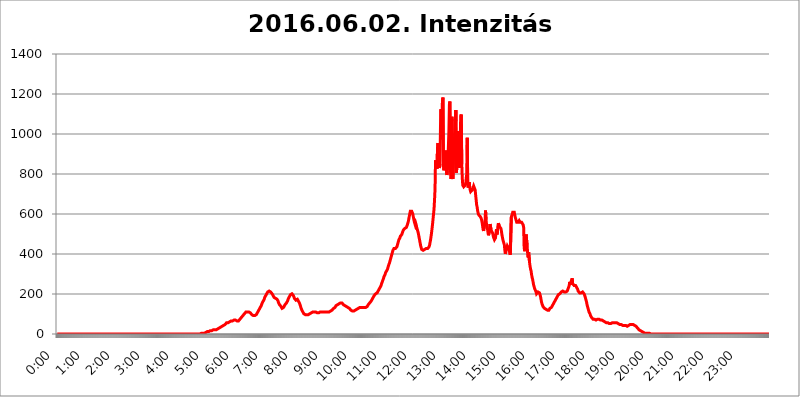
| Category | 2016.06.02. Intenzitás [W/m^2] |
|---|---|
| 0.0 | 0 |
| 0.0006944444444444445 | 0 |
| 0.001388888888888889 | 0 |
| 0.0020833333333333333 | 0 |
| 0.002777777777777778 | 0 |
| 0.003472222222222222 | 0 |
| 0.004166666666666667 | 0 |
| 0.004861111111111111 | 0 |
| 0.005555555555555556 | 0 |
| 0.0062499999999999995 | 0 |
| 0.006944444444444444 | 0 |
| 0.007638888888888889 | 0 |
| 0.008333333333333333 | 0 |
| 0.009027777777777779 | 0 |
| 0.009722222222222222 | 0 |
| 0.010416666666666666 | 0 |
| 0.011111111111111112 | 0 |
| 0.011805555555555555 | 0 |
| 0.012499999999999999 | 0 |
| 0.013194444444444444 | 0 |
| 0.013888888888888888 | 0 |
| 0.014583333333333332 | 0 |
| 0.015277777777777777 | 0 |
| 0.015972222222222224 | 0 |
| 0.016666666666666666 | 0 |
| 0.017361111111111112 | 0 |
| 0.018055555555555557 | 0 |
| 0.01875 | 0 |
| 0.019444444444444445 | 0 |
| 0.02013888888888889 | 0 |
| 0.020833333333333332 | 0 |
| 0.02152777777777778 | 0 |
| 0.022222222222222223 | 0 |
| 0.02291666666666667 | 0 |
| 0.02361111111111111 | 0 |
| 0.024305555555555556 | 0 |
| 0.024999999999999998 | 0 |
| 0.025694444444444447 | 0 |
| 0.02638888888888889 | 0 |
| 0.027083333333333334 | 0 |
| 0.027777777777777776 | 0 |
| 0.02847222222222222 | 0 |
| 0.029166666666666664 | 0 |
| 0.029861111111111113 | 0 |
| 0.030555555555555555 | 0 |
| 0.03125 | 0 |
| 0.03194444444444445 | 0 |
| 0.03263888888888889 | 0 |
| 0.03333333333333333 | 0 |
| 0.034027777777777775 | 0 |
| 0.034722222222222224 | 0 |
| 0.035416666666666666 | 0 |
| 0.036111111111111115 | 0 |
| 0.03680555555555556 | 0 |
| 0.0375 | 0 |
| 0.03819444444444444 | 0 |
| 0.03888888888888889 | 0 |
| 0.03958333333333333 | 0 |
| 0.04027777777777778 | 0 |
| 0.04097222222222222 | 0 |
| 0.041666666666666664 | 0 |
| 0.042361111111111106 | 0 |
| 0.04305555555555556 | 0 |
| 0.043750000000000004 | 0 |
| 0.044444444444444446 | 0 |
| 0.04513888888888889 | 0 |
| 0.04583333333333334 | 0 |
| 0.04652777777777778 | 0 |
| 0.04722222222222222 | 0 |
| 0.04791666666666666 | 0 |
| 0.04861111111111111 | 0 |
| 0.049305555555555554 | 0 |
| 0.049999999999999996 | 0 |
| 0.05069444444444445 | 0 |
| 0.051388888888888894 | 0 |
| 0.052083333333333336 | 0 |
| 0.05277777777777778 | 0 |
| 0.05347222222222222 | 0 |
| 0.05416666666666667 | 0 |
| 0.05486111111111111 | 0 |
| 0.05555555555555555 | 0 |
| 0.05625 | 0 |
| 0.05694444444444444 | 0 |
| 0.057638888888888885 | 0 |
| 0.05833333333333333 | 0 |
| 0.05902777777777778 | 0 |
| 0.059722222222222225 | 0 |
| 0.06041666666666667 | 0 |
| 0.061111111111111116 | 0 |
| 0.06180555555555556 | 0 |
| 0.0625 | 0 |
| 0.06319444444444444 | 0 |
| 0.06388888888888888 | 0 |
| 0.06458333333333334 | 0 |
| 0.06527777777777778 | 0 |
| 0.06597222222222222 | 0 |
| 0.06666666666666667 | 0 |
| 0.06736111111111111 | 0 |
| 0.06805555555555555 | 0 |
| 0.06874999999999999 | 0 |
| 0.06944444444444443 | 0 |
| 0.07013888888888889 | 0 |
| 0.07083333333333333 | 0 |
| 0.07152777777777779 | 0 |
| 0.07222222222222223 | 0 |
| 0.07291666666666667 | 0 |
| 0.07361111111111111 | 0 |
| 0.07430555555555556 | 0 |
| 0.075 | 0 |
| 0.07569444444444444 | 0 |
| 0.0763888888888889 | 0 |
| 0.07708333333333334 | 0 |
| 0.07777777777777778 | 0 |
| 0.07847222222222222 | 0 |
| 0.07916666666666666 | 0 |
| 0.0798611111111111 | 0 |
| 0.08055555555555556 | 0 |
| 0.08125 | 0 |
| 0.08194444444444444 | 0 |
| 0.08263888888888889 | 0 |
| 0.08333333333333333 | 0 |
| 0.08402777777777777 | 0 |
| 0.08472222222222221 | 0 |
| 0.08541666666666665 | 0 |
| 0.08611111111111112 | 0 |
| 0.08680555555555557 | 0 |
| 0.08750000000000001 | 0 |
| 0.08819444444444445 | 0 |
| 0.08888888888888889 | 0 |
| 0.08958333333333333 | 0 |
| 0.09027777777777778 | 0 |
| 0.09097222222222222 | 0 |
| 0.09166666666666667 | 0 |
| 0.09236111111111112 | 0 |
| 0.09305555555555556 | 0 |
| 0.09375 | 0 |
| 0.09444444444444444 | 0 |
| 0.09513888888888888 | 0 |
| 0.09583333333333333 | 0 |
| 0.09652777777777777 | 0 |
| 0.09722222222222222 | 0 |
| 0.09791666666666667 | 0 |
| 0.09861111111111111 | 0 |
| 0.09930555555555555 | 0 |
| 0.09999999999999999 | 0 |
| 0.10069444444444443 | 0 |
| 0.1013888888888889 | 0 |
| 0.10208333333333335 | 0 |
| 0.10277777777777779 | 0 |
| 0.10347222222222223 | 0 |
| 0.10416666666666667 | 0 |
| 0.10486111111111111 | 0 |
| 0.10555555555555556 | 0 |
| 0.10625 | 0 |
| 0.10694444444444444 | 0 |
| 0.1076388888888889 | 0 |
| 0.10833333333333334 | 0 |
| 0.10902777777777778 | 0 |
| 0.10972222222222222 | 0 |
| 0.1111111111111111 | 0 |
| 0.11180555555555556 | 0 |
| 0.11180555555555556 | 0 |
| 0.1125 | 0 |
| 0.11319444444444444 | 0 |
| 0.11388888888888889 | 0 |
| 0.11458333333333333 | 0 |
| 0.11527777777777777 | 0 |
| 0.11597222222222221 | 0 |
| 0.11666666666666665 | 0 |
| 0.1173611111111111 | 0 |
| 0.11805555555555557 | 0 |
| 0.11944444444444445 | 0 |
| 0.12013888888888889 | 0 |
| 0.12083333333333333 | 0 |
| 0.12152777777777778 | 0 |
| 0.12222222222222223 | 0 |
| 0.12291666666666667 | 0 |
| 0.12291666666666667 | 0 |
| 0.12361111111111112 | 0 |
| 0.12430555555555556 | 0 |
| 0.125 | 0 |
| 0.12569444444444444 | 0 |
| 0.12638888888888888 | 0 |
| 0.12708333333333333 | 0 |
| 0.16875 | 0 |
| 0.12847222222222224 | 0 |
| 0.12916666666666668 | 0 |
| 0.12986111111111112 | 0 |
| 0.13055555555555556 | 0 |
| 0.13125 | 0 |
| 0.13194444444444445 | 0 |
| 0.1326388888888889 | 0 |
| 0.13333333333333333 | 0 |
| 0.13402777777777777 | 0 |
| 0.13402777777777777 | 0 |
| 0.13472222222222222 | 0 |
| 0.13541666666666666 | 0 |
| 0.1361111111111111 | 0 |
| 0.13749999999999998 | 0 |
| 0.13819444444444443 | 0 |
| 0.1388888888888889 | 0 |
| 0.13958333333333334 | 0 |
| 0.14027777777777778 | 0 |
| 0.14097222222222222 | 0 |
| 0.14166666666666666 | 0 |
| 0.1423611111111111 | 0 |
| 0.14305555555555557 | 0 |
| 0.14375000000000002 | 0 |
| 0.14444444444444446 | 0 |
| 0.1451388888888889 | 0 |
| 0.1451388888888889 | 0 |
| 0.14652777777777778 | 0 |
| 0.14722222222222223 | 0 |
| 0.14791666666666667 | 0 |
| 0.1486111111111111 | 0 |
| 0.14930555555555555 | 0 |
| 0.15 | 0 |
| 0.15069444444444444 | 0 |
| 0.15138888888888888 | 0 |
| 0.15208333333333332 | 0 |
| 0.15277777777777776 | 0 |
| 0.15347222222222223 | 0 |
| 0.15416666666666667 | 0 |
| 0.15486111111111112 | 0 |
| 0.15555555555555556 | 0 |
| 0.15625 | 0 |
| 0.15694444444444444 | 0 |
| 0.15763888888888888 | 0 |
| 0.15833333333333333 | 0 |
| 0.15902777777777777 | 0 |
| 0.15972222222222224 | 0 |
| 0.16041666666666668 | 0 |
| 0.16111111111111112 | 0 |
| 0.16180555555555556 | 0 |
| 0.1625 | 0 |
| 0.16319444444444445 | 0 |
| 0.1638888888888889 | 0 |
| 0.16458333333333333 | 0 |
| 0.16527777777777777 | 0 |
| 0.16597222222222222 | 0 |
| 0.16666666666666666 | 0 |
| 0.1673611111111111 | 0 |
| 0.16805555555555554 | 0 |
| 0.16874999999999998 | 0 |
| 0.16944444444444443 | 0 |
| 0.17013888888888887 | 0 |
| 0.1708333333333333 | 0 |
| 0.17152777777777775 | 0 |
| 0.17222222222222225 | 0 |
| 0.1729166666666667 | 0 |
| 0.17361111111111113 | 0 |
| 0.17430555555555557 | 0 |
| 0.17500000000000002 | 0 |
| 0.17569444444444446 | 0 |
| 0.1763888888888889 | 0 |
| 0.17708333333333334 | 0 |
| 0.17777777777777778 | 0 |
| 0.17847222222222223 | 0 |
| 0.17916666666666667 | 0 |
| 0.1798611111111111 | 0 |
| 0.18055555555555555 | 0 |
| 0.18125 | 0 |
| 0.18194444444444444 | 0 |
| 0.1826388888888889 | 0 |
| 0.18333333333333335 | 0 |
| 0.1840277777777778 | 0 |
| 0.18472222222222223 | 0 |
| 0.18541666666666667 | 0 |
| 0.18611111111111112 | 0 |
| 0.18680555555555556 | 0 |
| 0.1875 | 0 |
| 0.18819444444444444 | 0 |
| 0.18888888888888888 | 0 |
| 0.18958333333333333 | 0 |
| 0.19027777777777777 | 0 |
| 0.1909722222222222 | 0 |
| 0.19166666666666665 | 0 |
| 0.19236111111111112 | 0 |
| 0.19305555555555554 | 0 |
| 0.19375 | 0 |
| 0.19444444444444445 | 0 |
| 0.1951388888888889 | 0 |
| 0.19583333333333333 | 0 |
| 0.19652777777777777 | 0 |
| 0.19722222222222222 | 0 |
| 0.19791666666666666 | 0 |
| 0.1986111111111111 | 0 |
| 0.19930555555555554 | 0 |
| 0.19999999999999998 | 0 |
| 0.20069444444444443 | 0 |
| 0.20138888888888887 | 3.525 |
| 0.2020833333333333 | 3.525 |
| 0.2027777777777778 | 3.525 |
| 0.2034722222222222 | 3.525 |
| 0.2041666666666667 | 3.525 |
| 0.20486111111111113 | 3.525 |
| 0.20555555555555557 | 3.525 |
| 0.20625000000000002 | 3.525 |
| 0.20694444444444446 | 3.525 |
| 0.2076388888888889 | 7.887 |
| 0.20833333333333334 | 7.887 |
| 0.20902777777777778 | 7.887 |
| 0.20972222222222223 | 7.887 |
| 0.21041666666666667 | 12.257 |
| 0.2111111111111111 | 12.257 |
| 0.21180555555555555 | 12.257 |
| 0.2125 | 12.257 |
| 0.21319444444444444 | 12.257 |
| 0.2138888888888889 | 16.636 |
| 0.21458333333333335 | 16.636 |
| 0.2152777777777778 | 16.636 |
| 0.21597222222222223 | 16.636 |
| 0.21666666666666667 | 16.636 |
| 0.21736111111111112 | 16.636 |
| 0.21805555555555556 | 21.024 |
| 0.21875 | 21.024 |
| 0.21944444444444444 | 21.024 |
| 0.22013888888888888 | 21.024 |
| 0.22083333333333333 | 21.024 |
| 0.22152777777777777 | 21.024 |
| 0.2222222222222222 | 21.024 |
| 0.22291666666666665 | 21.024 |
| 0.2236111111111111 | 25.419 |
| 0.22430555555555556 | 25.419 |
| 0.225 | 25.419 |
| 0.22569444444444445 | 29.823 |
| 0.2263888888888889 | 29.823 |
| 0.22708333333333333 | 29.823 |
| 0.22777777777777777 | 34.234 |
| 0.22847222222222222 | 34.234 |
| 0.22916666666666666 | 34.234 |
| 0.2298611111111111 | 38.653 |
| 0.23055555555555554 | 38.653 |
| 0.23124999999999998 | 38.653 |
| 0.23194444444444443 | 43.079 |
| 0.23263888888888887 | 43.079 |
| 0.2333333333333333 | 43.079 |
| 0.2340277777777778 | 47.511 |
| 0.2347222222222222 | 47.511 |
| 0.2354166666666667 | 47.511 |
| 0.23611111111111113 | 51.951 |
| 0.23680555555555557 | 51.951 |
| 0.23750000000000002 | 56.398 |
| 0.23819444444444446 | 56.398 |
| 0.2388888888888889 | 56.398 |
| 0.23958333333333334 | 56.398 |
| 0.24027777777777778 | 60.85 |
| 0.24097222222222223 | 60.85 |
| 0.24166666666666667 | 60.85 |
| 0.2423611111111111 | 65.31 |
| 0.24305555555555555 | 65.31 |
| 0.24375 | 65.31 |
| 0.24444444444444446 | 65.31 |
| 0.24513888888888888 | 65.31 |
| 0.24583333333333335 | 65.31 |
| 0.2465277777777778 | 69.775 |
| 0.24722222222222223 | 69.775 |
| 0.24791666666666667 | 69.775 |
| 0.24861111111111112 | 69.775 |
| 0.24930555555555556 | 69.775 |
| 0.25 | 69.775 |
| 0.25069444444444444 | 69.775 |
| 0.2513888888888889 | 69.775 |
| 0.2520833333333333 | 65.31 |
| 0.25277777777777777 | 65.31 |
| 0.2534722222222222 | 65.31 |
| 0.25416666666666665 | 65.31 |
| 0.2548611111111111 | 65.31 |
| 0.2555555555555556 | 69.775 |
| 0.25625000000000003 | 74.246 |
| 0.2569444444444445 | 74.246 |
| 0.2576388888888889 | 78.722 |
| 0.25833333333333336 | 83.205 |
| 0.2590277777777778 | 83.205 |
| 0.25972222222222224 | 87.692 |
| 0.2604166666666667 | 92.184 |
| 0.2611111111111111 | 96.682 |
| 0.26180555555555557 | 96.682 |
| 0.2625 | 101.184 |
| 0.26319444444444445 | 105.69 |
| 0.2638888888888889 | 105.69 |
| 0.26458333333333334 | 110.201 |
| 0.2652777777777778 | 110.201 |
| 0.2659722222222222 | 110.201 |
| 0.26666666666666666 | 110.201 |
| 0.2673611111111111 | 110.201 |
| 0.26805555555555555 | 110.201 |
| 0.26875 | 110.201 |
| 0.26944444444444443 | 110.201 |
| 0.2701388888888889 | 110.201 |
| 0.2708333333333333 | 105.69 |
| 0.27152777777777776 | 105.69 |
| 0.2722222222222222 | 101.184 |
| 0.27291666666666664 | 96.682 |
| 0.2736111111111111 | 92.184 |
| 0.2743055555555555 | 92.184 |
| 0.27499999999999997 | 92.184 |
| 0.27569444444444446 | 87.692 |
| 0.27638888888888885 | 87.692 |
| 0.27708333333333335 | 92.184 |
| 0.2777777777777778 | 92.184 |
| 0.27847222222222223 | 96.682 |
| 0.2791666666666667 | 96.682 |
| 0.2798611111111111 | 101.184 |
| 0.28055555555555556 | 105.69 |
| 0.28125 | 110.201 |
| 0.28194444444444444 | 114.716 |
| 0.2826388888888889 | 119.235 |
| 0.2833333333333333 | 123.758 |
| 0.28402777777777777 | 128.284 |
| 0.2847222222222222 | 132.814 |
| 0.28541666666666665 | 137.347 |
| 0.28611111111111115 | 141.884 |
| 0.28680555555555554 | 146.423 |
| 0.28750000000000003 | 155.509 |
| 0.2881944444444445 | 160.056 |
| 0.2888888888888889 | 164.605 |
| 0.28958333333333336 | 169.156 |
| 0.2902777777777778 | 173.709 |
| 0.29097222222222224 | 182.82 |
| 0.2916666666666667 | 187.378 |
| 0.2923611111111111 | 191.937 |
| 0.29305555555555557 | 196.497 |
| 0.29375 | 201.058 |
| 0.29444444444444445 | 205.62 |
| 0.2951388888888889 | 210.182 |
| 0.29583333333333334 | 210.182 |
| 0.2965277777777778 | 214.746 |
| 0.2972222222222222 | 214.746 |
| 0.29791666666666666 | 214.746 |
| 0.2986111111111111 | 214.746 |
| 0.29930555555555555 | 210.182 |
| 0.3 | 205.62 |
| 0.30069444444444443 | 205.62 |
| 0.3013888888888889 | 201.058 |
| 0.3020833333333333 | 196.497 |
| 0.30277777777777776 | 191.937 |
| 0.3034722222222222 | 187.378 |
| 0.30416666666666664 | 182.82 |
| 0.3048611111111111 | 182.82 |
| 0.3055555555555555 | 178.264 |
| 0.30624999999999997 | 178.264 |
| 0.3069444444444444 | 173.709 |
| 0.3076388888888889 | 173.709 |
| 0.30833333333333335 | 173.709 |
| 0.3090277777777778 | 169.156 |
| 0.30972222222222223 | 164.605 |
| 0.3104166666666667 | 155.509 |
| 0.3111111111111111 | 150.964 |
| 0.31180555555555556 | 146.423 |
| 0.3125 | 141.884 |
| 0.31319444444444444 | 141.884 |
| 0.3138888888888889 | 137.347 |
| 0.3145833333333333 | 132.814 |
| 0.31527777777777777 | 128.284 |
| 0.3159722222222222 | 128.284 |
| 0.31666666666666665 | 128.284 |
| 0.31736111111111115 | 132.814 |
| 0.31805555555555554 | 137.347 |
| 0.31875000000000003 | 137.347 |
| 0.3194444444444445 | 146.423 |
| 0.3201388888888889 | 146.423 |
| 0.32083333333333336 | 150.964 |
| 0.3215277777777778 | 155.509 |
| 0.32222222222222224 | 160.056 |
| 0.3229166666666667 | 164.605 |
| 0.3236111111111111 | 169.156 |
| 0.32430555555555557 | 178.264 |
| 0.325 | 182.82 |
| 0.32569444444444445 | 187.378 |
| 0.3263888888888889 | 191.937 |
| 0.32708333333333334 | 196.497 |
| 0.3277777777777778 | 201.058 |
| 0.3284722222222222 | 201.058 |
| 0.32916666666666666 | 201.058 |
| 0.3298611111111111 | 201.058 |
| 0.33055555555555555 | 196.497 |
| 0.33125 | 191.937 |
| 0.33194444444444443 | 187.378 |
| 0.3326388888888889 | 178.264 |
| 0.3333333333333333 | 178.264 |
| 0.3340277777777778 | 173.709 |
| 0.3347222222222222 | 169.156 |
| 0.3354166666666667 | 173.709 |
| 0.3361111111111111 | 173.709 |
| 0.3368055555555556 | 173.709 |
| 0.33749999999999997 | 169.156 |
| 0.33819444444444446 | 164.605 |
| 0.33888888888888885 | 164.605 |
| 0.33958333333333335 | 155.509 |
| 0.34027777777777773 | 150.964 |
| 0.34097222222222223 | 141.884 |
| 0.3416666666666666 | 132.814 |
| 0.3423611111111111 | 128.284 |
| 0.3430555555555555 | 119.235 |
| 0.34375 | 114.716 |
| 0.3444444444444445 | 110.201 |
| 0.3451388888888889 | 105.69 |
| 0.3458333333333334 | 101.184 |
| 0.34652777777777777 | 101.184 |
| 0.34722222222222227 | 96.682 |
| 0.34791666666666665 | 96.682 |
| 0.34861111111111115 | 96.682 |
| 0.34930555555555554 | 96.682 |
| 0.35000000000000003 | 96.682 |
| 0.3506944444444444 | 96.682 |
| 0.3513888888888889 | 96.682 |
| 0.3520833333333333 | 96.682 |
| 0.3527777777777778 | 101.184 |
| 0.3534722222222222 | 101.184 |
| 0.3541666666666667 | 101.184 |
| 0.3548611111111111 | 101.184 |
| 0.35555555555555557 | 105.69 |
| 0.35625 | 105.69 |
| 0.35694444444444445 | 110.201 |
| 0.3576388888888889 | 110.201 |
| 0.35833333333333334 | 110.201 |
| 0.3590277777777778 | 110.201 |
| 0.3597222222222222 | 110.201 |
| 0.36041666666666666 | 110.201 |
| 0.3611111111111111 | 110.201 |
| 0.36180555555555555 | 110.201 |
| 0.3625 | 110.201 |
| 0.36319444444444443 | 110.201 |
| 0.3638888888888889 | 110.201 |
| 0.3645833333333333 | 105.69 |
| 0.3652777777777778 | 105.69 |
| 0.3659722222222222 | 105.69 |
| 0.3666666666666667 | 105.69 |
| 0.3673611111111111 | 105.69 |
| 0.3680555555555556 | 105.69 |
| 0.36874999999999997 | 110.201 |
| 0.36944444444444446 | 110.201 |
| 0.37013888888888885 | 110.201 |
| 0.37083333333333335 | 110.201 |
| 0.37152777777777773 | 110.201 |
| 0.37222222222222223 | 110.201 |
| 0.3729166666666666 | 110.201 |
| 0.3736111111111111 | 110.201 |
| 0.3743055555555555 | 110.201 |
| 0.375 | 110.201 |
| 0.3756944444444445 | 110.201 |
| 0.3763888888888889 | 110.201 |
| 0.3770833333333334 | 110.201 |
| 0.37777777777777777 | 110.201 |
| 0.37847222222222227 | 110.201 |
| 0.37916666666666665 | 110.201 |
| 0.37986111111111115 | 110.201 |
| 0.38055555555555554 | 110.201 |
| 0.38125000000000003 | 110.201 |
| 0.3819444444444444 | 110.201 |
| 0.3826388888888889 | 110.201 |
| 0.3833333333333333 | 114.716 |
| 0.3840277777777778 | 114.716 |
| 0.3847222222222222 | 114.716 |
| 0.3854166666666667 | 119.235 |
| 0.3861111111111111 | 123.758 |
| 0.38680555555555557 | 123.758 |
| 0.3875 | 128.284 |
| 0.38819444444444445 | 128.284 |
| 0.3888888888888889 | 132.814 |
| 0.38958333333333334 | 132.814 |
| 0.3902777777777778 | 137.347 |
| 0.3909722222222222 | 141.884 |
| 0.39166666666666666 | 141.884 |
| 0.3923611111111111 | 146.423 |
| 0.39305555555555555 | 146.423 |
| 0.39375 | 146.423 |
| 0.39444444444444443 | 150.964 |
| 0.3951388888888889 | 150.964 |
| 0.3958333333333333 | 155.509 |
| 0.3965277777777778 | 155.509 |
| 0.3972222222222222 | 155.509 |
| 0.3979166666666667 | 155.509 |
| 0.3986111111111111 | 155.509 |
| 0.3993055555555556 | 155.509 |
| 0.39999999999999997 | 155.509 |
| 0.40069444444444446 | 150.964 |
| 0.40138888888888885 | 146.423 |
| 0.40208333333333335 | 146.423 |
| 0.40277777777777773 | 141.884 |
| 0.40347222222222223 | 141.884 |
| 0.4041666666666666 | 137.347 |
| 0.4048611111111111 | 137.347 |
| 0.4055555555555555 | 137.347 |
| 0.40625 | 137.347 |
| 0.4069444444444445 | 132.814 |
| 0.4076388888888889 | 132.814 |
| 0.4083333333333334 | 132.814 |
| 0.40902777777777777 | 128.284 |
| 0.40972222222222227 | 128.284 |
| 0.41041666666666665 | 123.758 |
| 0.41111111111111115 | 123.758 |
| 0.41180555555555554 | 119.235 |
| 0.41250000000000003 | 119.235 |
| 0.4131944444444444 | 114.716 |
| 0.4138888888888889 | 114.716 |
| 0.4145833333333333 | 110.201 |
| 0.4152777777777778 | 110.201 |
| 0.4159722222222222 | 114.716 |
| 0.4166666666666667 | 114.716 |
| 0.4173611111111111 | 114.716 |
| 0.41805555555555557 | 119.235 |
| 0.41875 | 119.235 |
| 0.41944444444444445 | 123.758 |
| 0.4201388888888889 | 123.758 |
| 0.42083333333333334 | 128.284 |
| 0.4215277777777778 | 128.284 |
| 0.4222222222222222 | 128.284 |
| 0.42291666666666666 | 132.814 |
| 0.4236111111111111 | 132.814 |
| 0.42430555555555555 | 132.814 |
| 0.425 | 132.814 |
| 0.42569444444444443 | 132.814 |
| 0.4263888888888889 | 132.814 |
| 0.4270833333333333 | 132.814 |
| 0.4277777777777778 | 132.814 |
| 0.4284722222222222 | 132.814 |
| 0.4291666666666667 | 132.814 |
| 0.4298611111111111 | 132.814 |
| 0.4305555555555556 | 132.814 |
| 0.43124999999999997 | 132.814 |
| 0.43194444444444446 | 132.814 |
| 0.43263888888888885 | 132.814 |
| 0.43333333333333335 | 137.347 |
| 0.43402777777777773 | 137.347 |
| 0.43472222222222223 | 137.347 |
| 0.4354166666666666 | 141.884 |
| 0.4361111111111111 | 146.423 |
| 0.4368055555555555 | 146.423 |
| 0.4375 | 150.964 |
| 0.4381944444444445 | 155.509 |
| 0.4388888888888889 | 155.509 |
| 0.4395833333333334 | 160.056 |
| 0.44027777777777777 | 164.605 |
| 0.44097222222222227 | 169.156 |
| 0.44166666666666665 | 173.709 |
| 0.44236111111111115 | 178.264 |
| 0.44305555555555554 | 182.82 |
| 0.44375000000000003 | 187.378 |
| 0.4444444444444444 | 191.937 |
| 0.4451388888888889 | 196.497 |
| 0.4458333333333333 | 196.497 |
| 0.4465277777777778 | 201.058 |
| 0.4472222222222222 | 201.058 |
| 0.4479166666666667 | 205.62 |
| 0.4486111111111111 | 205.62 |
| 0.44930555555555557 | 210.182 |
| 0.45 | 214.746 |
| 0.45069444444444445 | 219.309 |
| 0.4513888888888889 | 223.873 |
| 0.45208333333333334 | 228.436 |
| 0.4527777777777778 | 233 |
| 0.4534722222222222 | 237.564 |
| 0.45416666666666666 | 242.127 |
| 0.4548611111111111 | 251.251 |
| 0.45555555555555555 | 255.813 |
| 0.45625 | 264.932 |
| 0.45694444444444443 | 269.49 |
| 0.4576388888888889 | 278.603 |
| 0.4583333333333333 | 287.709 |
| 0.4590277777777778 | 292.259 |
| 0.4597222222222222 | 296.808 |
| 0.4604166666666667 | 305.898 |
| 0.4611111111111111 | 310.44 |
| 0.4618055555555556 | 314.98 |
| 0.46249999999999997 | 319.517 |
| 0.46319444444444446 | 324.052 |
| 0.46388888888888885 | 333.113 |
| 0.46458333333333335 | 342.162 |
| 0.46527777777777773 | 346.682 |
| 0.46597222222222223 | 355.712 |
| 0.4666666666666666 | 364.728 |
| 0.4673611111111111 | 373.729 |
| 0.4680555555555555 | 382.715 |
| 0.46875 | 391.685 |
| 0.4694444444444445 | 400.638 |
| 0.4701388888888889 | 409.574 |
| 0.4708333333333334 | 418.492 |
| 0.47152777777777777 | 422.943 |
| 0.47222222222222227 | 427.39 |
| 0.47291666666666665 | 427.39 |
| 0.47361111111111115 | 427.39 |
| 0.47430555555555554 | 427.39 |
| 0.47500000000000003 | 431.833 |
| 0.4756944444444444 | 431.833 |
| 0.4763888888888889 | 436.27 |
| 0.4770833333333333 | 445.129 |
| 0.4777777777777778 | 453.968 |
| 0.4784722222222222 | 462.786 |
| 0.4791666666666667 | 471.582 |
| 0.4798611111111111 | 475.972 |
| 0.48055555555555557 | 480.356 |
| 0.48125 | 489.108 |
| 0.48194444444444445 | 489.108 |
| 0.4826388888888889 | 493.475 |
| 0.48333333333333334 | 497.836 |
| 0.4840277777777778 | 506.542 |
| 0.4847222222222222 | 510.885 |
| 0.48541666666666666 | 519.555 |
| 0.4861111111111111 | 523.88 |
| 0.48680555555555555 | 523.88 |
| 0.4875 | 528.2 |
| 0.48819444444444443 | 528.2 |
| 0.4888888888888889 | 528.2 |
| 0.4895833333333333 | 532.513 |
| 0.4902777777777778 | 536.82 |
| 0.4909722222222222 | 545.416 |
| 0.4916666666666667 | 553.986 |
| 0.4923611111111111 | 562.53 |
| 0.4930555555555556 | 575.299 |
| 0.49374999999999997 | 588.009 |
| 0.49444444444444446 | 600.661 |
| 0.49513888888888885 | 613.252 |
| 0.49583333333333335 | 613.252 |
| 0.49652777777777773 | 613.252 |
| 0.49722222222222223 | 613.252 |
| 0.4979166666666666 | 609.062 |
| 0.4986111111111111 | 600.661 |
| 0.4993055555555555 | 588.009 |
| 0.5 | 575.299 |
| 0.5006944444444444 | 562.53 |
| 0.5013888888888889 | 553.986 |
| 0.5020833333333333 | 545.416 |
| 0.5027777777777778 | 553.986 |
| 0.5034722222222222 | 545.416 |
| 0.5041666666666667 | 532.513 |
| 0.5048611111111111 | 523.88 |
| 0.5055555555555555 | 515.223 |
| 0.50625 | 506.542 |
| 0.5069444444444444 | 493.475 |
| 0.5076388888888889 | 480.356 |
| 0.5083333333333333 | 467.187 |
| 0.5090277777777777 | 453.968 |
| 0.5097222222222222 | 440.702 |
| 0.5104166666666666 | 431.833 |
| 0.5111111111111112 | 422.943 |
| 0.5118055555555555 | 422.943 |
| 0.5125000000000001 | 418.492 |
| 0.5131944444444444 | 418.492 |
| 0.513888888888889 | 418.492 |
| 0.5145833333333333 | 422.943 |
| 0.5152777777777778 | 422.943 |
| 0.5159722222222222 | 422.943 |
| 0.5166666666666667 | 427.39 |
| 0.517361111111111 | 427.39 |
| 0.5180555555555556 | 427.39 |
| 0.5187499999999999 | 427.39 |
| 0.5194444444444445 | 427.39 |
| 0.5201388888888888 | 427.39 |
| 0.5208333333333334 | 431.833 |
| 0.5215277777777778 | 436.27 |
| 0.5222222222222223 | 445.129 |
| 0.5229166666666667 | 458.38 |
| 0.5236111111111111 | 471.582 |
| 0.5243055555555556 | 489.108 |
| 0.525 | 506.542 |
| 0.5256944444444445 | 528.2 |
| 0.5263888888888889 | 549.704 |
| 0.5270833333333333 | 575.299 |
| 0.5277777777777778 | 600.661 |
| 0.5284722222222222 | 625.784 |
| 0.5291666666666667 | 671.22 |
| 0.5298611111111111 | 723.889 |
| 0.5305555555555556 | 868.305 |
| 0.53125 | 845.365 |
| 0.5319444444444444 | 845.365 |
| 0.5326388888888889 | 826.123 |
| 0.5333333333333333 | 928.819 |
| 0.5340277777777778 | 955.071 |
| 0.5347222222222222 | 860.676 |
| 0.5354166666666667 | 837.682 |
| 0.5361111111111111 | 829.981 |
| 0.5368055555555555 | 849.199 |
| 0.5375 | 1037.277 |
| 0.5381944444444444 | 1124.056 |
| 0.5388888888888889 | 973.772 |
| 0.5395833333333333 | 1101.226 |
| 0.5402777777777777 | 1166.46 |
| 0.5409722222222222 | 1182.099 |
| 0.5416666666666666 | 837.682 |
| 0.5423611111111112 | 818.392 |
| 0.5430555555555555 | 818.392 |
| 0.5437500000000001 | 883.516 |
| 0.5444444444444444 | 917.534 |
| 0.545138888888889 | 856.855 |
| 0.5458333333333333 | 810.641 |
| 0.5465277777777778 | 795.074 |
| 0.5472222222222222 | 814.519 |
| 0.5479166666666667 | 868.305 |
| 0.548611111111111 | 940.082 |
| 0.5493055555555556 | 1014.852 |
| 0.5499999999999999 | 1147.086 |
| 0.5506944444444445 | 1162.571 |
| 0.5513888888888888 | 822.26 |
| 0.5520833333333334 | 775.492 |
| 0.5527777777777778 | 783.342 |
| 0.5534722222222223 | 1086.097 |
| 0.5541666666666667 | 1063.51 |
| 0.5548611111111111 | 775.492 |
| 0.5555555555555556 | 775.492 |
| 0.55625 | 936.33 |
| 0.5569444444444445 | 925.06 |
| 0.5576388888888889 | 1003.65 |
| 0.5583333333333333 | 984.98 |
| 0.5590277777777778 | 1120.238 |
| 0.5597222222222222 | 806.757 |
| 0.5604166666666667 | 829.981 |
| 0.5611111111111111 | 829.981 |
| 0.5618055555555556 | 966.295 |
| 0.5625 | 1014.852 |
| 0.5631944444444444 | 999.916 |
| 0.5638888888888889 | 829.981 |
| 0.5645833333333333 | 988.714 |
| 0.5652777777777778 | 999.916 |
| 0.5659722222222222 | 1089.873 |
| 0.5666666666666667 | 1097.437 |
| 0.5673611111111111 | 849.199 |
| 0.5680555555555555 | 779.42 |
| 0.56875 | 743.859 |
| 0.5694444444444444 | 747.834 |
| 0.5701388888888889 | 735.89 |
| 0.5708333333333333 | 735.89 |
| 0.5715277777777777 | 735.89 |
| 0.5722222222222222 | 743.859 |
| 0.5729166666666666 | 751.803 |
| 0.5736111111111112 | 779.42 |
| 0.5743055555555555 | 798.974 |
| 0.5750000000000001 | 981.244 |
| 0.5756944444444444 | 751.803 |
| 0.576388888888889 | 731.896 |
| 0.5770833333333333 | 727.896 |
| 0.5777777777777778 | 759.723 |
| 0.5784722222222222 | 735.89 |
| 0.5791666666666667 | 719.877 |
| 0.579861111111111 | 711.832 |
| 0.5805555555555556 | 715.858 |
| 0.5812499999999999 | 715.858 |
| 0.5819444444444445 | 719.877 |
| 0.5826388888888888 | 723.889 |
| 0.5833333333333334 | 731.896 |
| 0.5840277777777778 | 739.877 |
| 0.5847222222222223 | 743.859 |
| 0.5854166666666667 | 739.877 |
| 0.5861111111111111 | 719.877 |
| 0.5868055555555556 | 695.666 |
| 0.5875 | 671.22 |
| 0.5881944444444445 | 646.537 |
| 0.5888888888888889 | 634.105 |
| 0.5895833333333333 | 617.436 |
| 0.5902777777777778 | 604.864 |
| 0.5909722222222222 | 596.45 |
| 0.5916666666666667 | 592.233 |
| 0.5923611111111111 | 592.233 |
| 0.5930555555555556 | 588.009 |
| 0.59375 | 583.779 |
| 0.5944444444444444 | 579.542 |
| 0.5951388888888889 | 571.049 |
| 0.5958333333333333 | 558.261 |
| 0.5965277777777778 | 541.121 |
| 0.5972222222222222 | 523.88 |
| 0.5979166666666667 | 515.223 |
| 0.5986111111111111 | 515.223 |
| 0.5993055555555555 | 519.555 |
| 0.6 | 562.53 |
| 0.6006944444444444 | 617.436 |
| 0.6013888888888889 | 571.049 |
| 0.6020833333333333 | 549.704 |
| 0.6027777777777777 | 536.82 |
| 0.6034722222222222 | 523.88 |
| 0.6041666666666666 | 506.542 |
| 0.6048611111111112 | 493.475 |
| 0.6055555555555555 | 493.475 |
| 0.6062500000000001 | 515.223 |
| 0.6069444444444444 | 549.704 |
| 0.607638888888889 | 549.704 |
| 0.6083333333333333 | 523.88 |
| 0.6090277777777778 | 515.223 |
| 0.6097222222222222 | 510.885 |
| 0.6104166666666667 | 506.542 |
| 0.611111111111111 | 497.836 |
| 0.6118055555555556 | 484.735 |
| 0.6124999999999999 | 480.356 |
| 0.6131944444444445 | 471.582 |
| 0.6138888888888888 | 471.582 |
| 0.6145833333333334 | 480.356 |
| 0.6152777777777778 | 484.735 |
| 0.6159722222222223 | 523.88 |
| 0.6166666666666667 | 497.836 |
| 0.6173611111111111 | 510.885 |
| 0.6180555555555556 | 541.121 |
| 0.61875 | 553.986 |
| 0.6194444444444445 | 549.704 |
| 0.6201388888888889 | 536.82 |
| 0.6208333333333333 | 532.513 |
| 0.6215277777777778 | 532.513 |
| 0.6222222222222222 | 528.2 |
| 0.6229166666666667 | 515.223 |
| 0.6236111111111111 | 497.836 |
| 0.6243055555555556 | 497.836 |
| 0.625 | 471.582 |
| 0.6256944444444444 | 462.786 |
| 0.6263888888888889 | 462.786 |
| 0.6270833333333333 | 445.129 |
| 0.6277777777777778 | 418.492 |
| 0.6284722222222222 | 400.638 |
| 0.6291666666666667 | 409.574 |
| 0.6298611111111111 | 422.943 |
| 0.6305555555555555 | 431.833 |
| 0.63125 | 440.702 |
| 0.6319444444444444 | 440.702 |
| 0.6326388888888889 | 436.27 |
| 0.6333333333333333 | 427.39 |
| 0.6340277777777777 | 418.492 |
| 0.6347222222222222 | 405.108 |
| 0.6354166666666666 | 396.164 |
| 0.6361111111111112 | 400.638 |
| 0.6368055555555555 | 583.779 |
| 0.6375000000000001 | 592.233 |
| 0.6381944444444444 | 600.661 |
| 0.638888888888889 | 609.062 |
| 0.6395833333333333 | 609.062 |
| 0.6402777777777778 | 609.062 |
| 0.6409722222222222 | 609.062 |
| 0.6416666666666667 | 596.45 |
| 0.642361111111111 | 583.779 |
| 0.6430555555555556 | 579.542 |
| 0.6437499999999999 | 566.793 |
| 0.6444444444444445 | 558.261 |
| 0.6451388888888888 | 553.986 |
| 0.6458333333333334 | 553.986 |
| 0.6465277777777778 | 558.261 |
| 0.6472222222222223 | 562.53 |
| 0.6479166666666667 | 566.793 |
| 0.6486111111111111 | 566.793 |
| 0.6493055555555556 | 558.261 |
| 0.65 | 553.986 |
| 0.6506944444444445 | 553.986 |
| 0.6513888888888889 | 558.261 |
| 0.6520833333333333 | 558.261 |
| 0.6527777777777778 | 553.986 |
| 0.6534722222222222 | 545.416 |
| 0.6541666666666667 | 532.513 |
| 0.6548611111111111 | 431.833 |
| 0.6555555555555556 | 414.035 |
| 0.65625 | 475.972 |
| 0.6569444444444444 | 489.108 |
| 0.6576388888888889 | 497.836 |
| 0.6583333333333333 | 493.475 |
| 0.6590277777777778 | 440.702 |
| 0.6597222222222222 | 405.108 |
| 0.6604166666666667 | 382.715 |
| 0.6611111111111111 | 409.574 |
| 0.6618055555555555 | 414.035 |
| 0.6625 | 355.712 |
| 0.6631944444444444 | 337.639 |
| 0.6638888888888889 | 324.052 |
| 0.6645833333333333 | 314.98 |
| 0.6652777777777777 | 296.808 |
| 0.6659722222222222 | 283.156 |
| 0.6666666666666666 | 274.047 |
| 0.6673611111111111 | 260.373 |
| 0.6680555555555556 | 246.689 |
| 0.6687500000000001 | 237.564 |
| 0.6694444444444444 | 228.436 |
| 0.6701388888888888 | 228.436 |
| 0.6708333333333334 | 223.873 |
| 0.6715277777777778 | 210.182 |
| 0.6722222222222222 | 201.058 |
| 0.6729166666666666 | 201.058 |
| 0.6736111111111112 | 205.62 |
| 0.6743055555555556 | 210.182 |
| 0.6749999999999999 | 210.182 |
| 0.6756944444444444 | 210.182 |
| 0.6763888888888889 | 205.62 |
| 0.6770833333333334 | 196.497 |
| 0.6777777777777777 | 187.378 |
| 0.6784722222222223 | 173.709 |
| 0.6791666666666667 | 160.056 |
| 0.6798611111111111 | 150.964 |
| 0.6805555555555555 | 146.423 |
| 0.68125 | 137.347 |
| 0.6819444444444445 | 137.347 |
| 0.6826388888888889 | 132.814 |
| 0.6833333333333332 | 128.284 |
| 0.6840277777777778 | 128.284 |
| 0.6847222222222222 | 123.758 |
| 0.6854166666666667 | 123.758 |
| 0.686111111111111 | 119.235 |
| 0.6868055555555556 | 119.235 |
| 0.6875 | 119.235 |
| 0.6881944444444444 | 119.235 |
| 0.688888888888889 | 119.235 |
| 0.6895833333333333 | 119.235 |
| 0.6902777777777778 | 123.758 |
| 0.6909722222222222 | 128.284 |
| 0.6916666666666668 | 128.284 |
| 0.6923611111111111 | 132.814 |
| 0.6930555555555555 | 132.814 |
| 0.69375 | 137.347 |
| 0.6944444444444445 | 141.884 |
| 0.6951388888888889 | 146.423 |
| 0.6958333333333333 | 150.964 |
| 0.6965277777777777 | 155.509 |
| 0.6972222222222223 | 160.056 |
| 0.6979166666666666 | 164.605 |
| 0.6986111111111111 | 169.156 |
| 0.6993055555555556 | 173.709 |
| 0.7000000000000001 | 178.264 |
| 0.7006944444444444 | 182.82 |
| 0.7013888888888888 | 187.378 |
| 0.7020833333333334 | 191.937 |
| 0.7027777777777778 | 196.497 |
| 0.7034722222222222 | 201.058 |
| 0.7041666666666666 | 201.058 |
| 0.7048611111111112 | 201.058 |
| 0.7055555555555556 | 201.058 |
| 0.7062499999999999 | 205.62 |
| 0.7069444444444444 | 210.182 |
| 0.7076388888888889 | 210.182 |
| 0.7083333333333334 | 210.182 |
| 0.7090277777777777 | 214.746 |
| 0.7097222222222223 | 210.182 |
| 0.7104166666666667 | 210.182 |
| 0.7111111111111111 | 210.182 |
| 0.7118055555555555 | 210.182 |
| 0.7125 | 210.182 |
| 0.7131944444444445 | 210.182 |
| 0.7138888888888889 | 210.182 |
| 0.7145833333333332 | 210.182 |
| 0.7152777777777778 | 214.746 |
| 0.7159722222222222 | 219.309 |
| 0.7166666666666667 | 228.436 |
| 0.717361111111111 | 233 |
| 0.7180555555555556 | 242.127 |
| 0.71875 | 260.373 |
| 0.7194444444444444 | 246.689 |
| 0.720138888888889 | 242.127 |
| 0.7208333333333333 | 242.127 |
| 0.7215277777777778 | 269.49 |
| 0.7222222222222222 | 278.603 |
| 0.7229166666666668 | 251.251 |
| 0.7236111111111111 | 246.689 |
| 0.7243055555555555 | 255.813 |
| 0.725 | 242.127 |
| 0.7256944444444445 | 242.127 |
| 0.7263888888888889 | 242.127 |
| 0.7270833333333333 | 242.127 |
| 0.7277777777777777 | 237.564 |
| 0.7284722222222223 | 233 |
| 0.7291666666666666 | 228.436 |
| 0.7298611111111111 | 223.873 |
| 0.7305555555555556 | 214.746 |
| 0.7312500000000001 | 214.746 |
| 0.7319444444444444 | 210.182 |
| 0.7326388888888888 | 205.62 |
| 0.7333333333333334 | 205.62 |
| 0.7340277777777778 | 205.62 |
| 0.7347222222222222 | 205.62 |
| 0.7354166666666666 | 210.182 |
| 0.7361111111111112 | 210.182 |
| 0.7368055555555556 | 210.182 |
| 0.7374999999999999 | 210.182 |
| 0.7381944444444444 | 205.62 |
| 0.7388888888888889 | 201.058 |
| 0.7395833333333334 | 196.497 |
| 0.7402777777777777 | 187.378 |
| 0.7409722222222223 | 178.264 |
| 0.7416666666666667 | 169.156 |
| 0.7423611111111111 | 160.056 |
| 0.7430555555555555 | 146.423 |
| 0.74375 | 137.347 |
| 0.7444444444444445 | 128.284 |
| 0.7451388888888889 | 119.235 |
| 0.7458333333333332 | 110.201 |
| 0.7465277777777778 | 105.69 |
| 0.7472222222222222 | 101.184 |
| 0.7479166666666667 | 92.184 |
| 0.748611111111111 | 87.692 |
| 0.7493055555555556 | 83.205 |
| 0.75 | 83.205 |
| 0.7506944444444444 | 78.722 |
| 0.751388888888889 | 74.246 |
| 0.7520833333333333 | 74.246 |
| 0.7527777777777778 | 74.246 |
| 0.7534722222222222 | 74.246 |
| 0.7541666666666668 | 74.246 |
| 0.7548611111111111 | 69.775 |
| 0.7555555555555555 | 69.775 |
| 0.75625 | 69.775 |
| 0.7569444444444445 | 69.775 |
| 0.7576388888888889 | 74.246 |
| 0.7583333333333333 | 74.246 |
| 0.7590277777777777 | 74.246 |
| 0.7597222222222223 | 74.246 |
| 0.7604166666666666 | 74.246 |
| 0.7611111111111111 | 69.775 |
| 0.7618055555555556 | 69.775 |
| 0.7625000000000001 | 69.775 |
| 0.7631944444444444 | 69.775 |
| 0.7638888888888888 | 69.775 |
| 0.7645833333333334 | 65.31 |
| 0.7652777777777778 | 65.31 |
| 0.7659722222222222 | 65.31 |
| 0.7666666666666666 | 65.31 |
| 0.7673611111111112 | 65.31 |
| 0.7680555555555556 | 60.85 |
| 0.7687499999999999 | 60.85 |
| 0.7694444444444444 | 60.85 |
| 0.7701388888888889 | 56.398 |
| 0.7708333333333334 | 56.398 |
| 0.7715277777777777 | 56.398 |
| 0.7722222222222223 | 56.398 |
| 0.7729166666666667 | 56.398 |
| 0.7736111111111111 | 51.951 |
| 0.7743055555555555 | 51.951 |
| 0.775 | 56.398 |
| 0.7756944444444445 | 51.951 |
| 0.7763888888888889 | 51.951 |
| 0.7770833333333332 | 51.951 |
| 0.7777777777777778 | 51.951 |
| 0.7784722222222222 | 56.398 |
| 0.7791666666666667 | 56.398 |
| 0.779861111111111 | 56.398 |
| 0.7805555555555556 | 56.398 |
| 0.78125 | 56.398 |
| 0.7819444444444444 | 56.398 |
| 0.782638888888889 | 56.398 |
| 0.7833333333333333 | 56.398 |
| 0.7840277777777778 | 56.398 |
| 0.7847222222222222 | 56.398 |
| 0.7854166666666668 | 51.951 |
| 0.7861111111111111 | 51.951 |
| 0.7868055555555555 | 51.951 |
| 0.7875 | 51.951 |
| 0.7881944444444445 | 51.951 |
| 0.7888888888888889 | 47.511 |
| 0.7895833333333333 | 47.511 |
| 0.7902777777777777 | 47.511 |
| 0.7909722222222223 | 47.511 |
| 0.7916666666666666 | 47.511 |
| 0.7923611111111111 | 43.079 |
| 0.7930555555555556 | 43.079 |
| 0.7937500000000001 | 43.079 |
| 0.7944444444444444 | 43.079 |
| 0.7951388888888888 | 43.079 |
| 0.7958333333333334 | 43.079 |
| 0.7965277777777778 | 43.079 |
| 0.7972222222222222 | 43.079 |
| 0.7979166666666666 | 38.653 |
| 0.7986111111111112 | 43.079 |
| 0.7993055555555556 | 38.653 |
| 0.7999999999999999 | 43.079 |
| 0.8006944444444444 | 43.079 |
| 0.8013888888888889 | 43.079 |
| 0.8020833333333334 | 43.079 |
| 0.8027777777777777 | 47.511 |
| 0.8034722222222223 | 47.511 |
| 0.8041666666666667 | 47.511 |
| 0.8048611111111111 | 47.511 |
| 0.8055555555555555 | 47.511 |
| 0.80625 | 47.511 |
| 0.8069444444444445 | 47.511 |
| 0.8076388888888889 | 47.511 |
| 0.8083333333333332 | 47.511 |
| 0.8090277777777778 | 47.511 |
| 0.8097222222222222 | 43.079 |
| 0.8104166666666667 | 43.079 |
| 0.811111111111111 | 38.653 |
| 0.8118055555555556 | 38.653 |
| 0.8125 | 38.653 |
| 0.8131944444444444 | 34.234 |
| 0.813888888888889 | 29.823 |
| 0.8145833333333333 | 29.823 |
| 0.8152777777777778 | 25.419 |
| 0.8159722222222222 | 21.024 |
| 0.8166666666666668 | 21.024 |
| 0.8173611111111111 | 16.636 |
| 0.8180555555555555 | 16.636 |
| 0.81875 | 12.257 |
| 0.8194444444444445 | 12.257 |
| 0.8201388888888889 | 12.257 |
| 0.8208333333333333 | 7.887 |
| 0.8215277777777777 | 7.887 |
| 0.8222222222222223 | 7.887 |
| 0.8229166666666666 | 7.887 |
| 0.8236111111111111 | 3.525 |
| 0.8243055555555556 | 3.525 |
| 0.8250000000000001 | 3.525 |
| 0.8256944444444444 | 3.525 |
| 0.8263888888888888 | 3.525 |
| 0.8270833333333334 | 3.525 |
| 0.8277777777777778 | 3.525 |
| 0.8284722222222222 | 3.525 |
| 0.8291666666666666 | 3.525 |
| 0.8298611111111112 | 3.525 |
| 0.8305555555555556 | 3.525 |
| 0.8312499999999999 | 3.525 |
| 0.8319444444444444 | 3.525 |
| 0.8326388888888889 | 0 |
| 0.8333333333333334 | 0 |
| 0.8340277777777777 | 0 |
| 0.8347222222222223 | 0 |
| 0.8354166666666667 | 0 |
| 0.8361111111111111 | 0 |
| 0.8368055555555555 | 0 |
| 0.8375 | 0 |
| 0.8381944444444445 | 0 |
| 0.8388888888888889 | 0 |
| 0.8395833333333332 | 0 |
| 0.8402777777777778 | 0 |
| 0.8409722222222222 | 0 |
| 0.8416666666666667 | 0 |
| 0.842361111111111 | 0 |
| 0.8430555555555556 | 0 |
| 0.84375 | 0 |
| 0.8444444444444444 | 0 |
| 0.845138888888889 | 0 |
| 0.8458333333333333 | 0 |
| 0.8465277777777778 | 0 |
| 0.8472222222222222 | 0 |
| 0.8479166666666668 | 0 |
| 0.8486111111111111 | 0 |
| 0.8493055555555555 | 0 |
| 0.85 | 0 |
| 0.8506944444444445 | 0 |
| 0.8513888888888889 | 0 |
| 0.8520833333333333 | 0 |
| 0.8527777777777777 | 0 |
| 0.8534722222222223 | 0 |
| 0.8541666666666666 | 0 |
| 0.8548611111111111 | 0 |
| 0.8555555555555556 | 0 |
| 0.8562500000000001 | 0 |
| 0.8569444444444444 | 0 |
| 0.8576388888888888 | 0 |
| 0.8583333333333334 | 0 |
| 0.8590277777777778 | 0 |
| 0.8597222222222222 | 0 |
| 0.8604166666666666 | 0 |
| 0.8611111111111112 | 0 |
| 0.8618055555555556 | 0 |
| 0.8624999999999999 | 0 |
| 0.8631944444444444 | 0 |
| 0.8638888888888889 | 0 |
| 0.8645833333333334 | 0 |
| 0.8652777777777777 | 0 |
| 0.8659722222222223 | 0 |
| 0.8666666666666667 | 0 |
| 0.8673611111111111 | 0 |
| 0.8680555555555555 | 0 |
| 0.86875 | 0 |
| 0.8694444444444445 | 0 |
| 0.8701388888888889 | 0 |
| 0.8708333333333332 | 0 |
| 0.8715277777777778 | 0 |
| 0.8722222222222222 | 0 |
| 0.8729166666666667 | 0 |
| 0.873611111111111 | 0 |
| 0.8743055555555556 | 0 |
| 0.875 | 0 |
| 0.8756944444444444 | 0 |
| 0.876388888888889 | 0 |
| 0.8770833333333333 | 0 |
| 0.8777777777777778 | 0 |
| 0.8784722222222222 | 0 |
| 0.8791666666666668 | 0 |
| 0.8798611111111111 | 0 |
| 0.8805555555555555 | 0 |
| 0.88125 | 0 |
| 0.8819444444444445 | 0 |
| 0.8826388888888889 | 0 |
| 0.8833333333333333 | 0 |
| 0.8840277777777777 | 0 |
| 0.8847222222222223 | 0 |
| 0.8854166666666666 | 0 |
| 0.8861111111111111 | 0 |
| 0.8868055555555556 | 0 |
| 0.8875000000000001 | 0 |
| 0.8881944444444444 | 0 |
| 0.8888888888888888 | 0 |
| 0.8895833333333334 | 0 |
| 0.8902777777777778 | 0 |
| 0.8909722222222222 | 0 |
| 0.8916666666666666 | 0 |
| 0.8923611111111112 | 0 |
| 0.8930555555555556 | 0 |
| 0.8937499999999999 | 0 |
| 0.8944444444444444 | 0 |
| 0.8951388888888889 | 0 |
| 0.8958333333333334 | 0 |
| 0.8965277777777777 | 0 |
| 0.8972222222222223 | 0 |
| 0.8979166666666667 | 0 |
| 0.8986111111111111 | 0 |
| 0.8993055555555555 | 0 |
| 0.9 | 0 |
| 0.9006944444444445 | 0 |
| 0.9013888888888889 | 0 |
| 0.9020833333333332 | 0 |
| 0.9027777777777778 | 0 |
| 0.9034722222222222 | 0 |
| 0.9041666666666667 | 0 |
| 0.904861111111111 | 0 |
| 0.9055555555555556 | 0 |
| 0.90625 | 0 |
| 0.9069444444444444 | 0 |
| 0.907638888888889 | 0 |
| 0.9083333333333333 | 0 |
| 0.9090277777777778 | 0 |
| 0.9097222222222222 | 0 |
| 0.9104166666666668 | 0 |
| 0.9111111111111111 | 0 |
| 0.9118055555555555 | 0 |
| 0.9125 | 0 |
| 0.9131944444444445 | 0 |
| 0.9138888888888889 | 0 |
| 0.9145833333333333 | 0 |
| 0.9152777777777777 | 0 |
| 0.9159722222222223 | 0 |
| 0.9166666666666666 | 0 |
| 0.9173611111111111 | 0 |
| 0.9180555555555556 | 0 |
| 0.9187500000000001 | 0 |
| 0.9194444444444444 | 0 |
| 0.9201388888888888 | 0 |
| 0.9208333333333334 | 0 |
| 0.9215277777777778 | 0 |
| 0.9222222222222222 | 0 |
| 0.9229166666666666 | 0 |
| 0.9236111111111112 | 0 |
| 0.9243055555555556 | 0 |
| 0.9249999999999999 | 0 |
| 0.9256944444444444 | 0 |
| 0.9263888888888889 | 0 |
| 0.9270833333333334 | 0 |
| 0.9277777777777777 | 0 |
| 0.9284722222222223 | 0 |
| 0.9291666666666667 | 0 |
| 0.9298611111111111 | 0 |
| 0.9305555555555555 | 0 |
| 0.93125 | 0 |
| 0.9319444444444445 | 0 |
| 0.9326388888888889 | 0 |
| 0.9333333333333332 | 0 |
| 0.9340277777777778 | 0 |
| 0.9347222222222222 | 0 |
| 0.9354166666666667 | 0 |
| 0.936111111111111 | 0 |
| 0.9368055555555556 | 0 |
| 0.9375 | 0 |
| 0.9381944444444444 | 0 |
| 0.938888888888889 | 0 |
| 0.9395833333333333 | 0 |
| 0.9402777777777778 | 0 |
| 0.9409722222222222 | 0 |
| 0.9416666666666668 | 0 |
| 0.9423611111111111 | 0 |
| 0.9430555555555555 | 0 |
| 0.94375 | 0 |
| 0.9444444444444445 | 0 |
| 0.9451388888888889 | 0 |
| 0.9458333333333333 | 0 |
| 0.9465277777777777 | 0 |
| 0.9472222222222223 | 0 |
| 0.9479166666666666 | 0 |
| 0.9486111111111111 | 0 |
| 0.9493055555555556 | 0 |
| 0.9500000000000001 | 0 |
| 0.9506944444444444 | 0 |
| 0.9513888888888888 | 0 |
| 0.9520833333333334 | 0 |
| 0.9527777777777778 | 0 |
| 0.9534722222222222 | 0 |
| 0.9541666666666666 | 0 |
| 0.9548611111111112 | 0 |
| 0.9555555555555556 | 0 |
| 0.9562499999999999 | 0 |
| 0.9569444444444444 | 0 |
| 0.9576388888888889 | 0 |
| 0.9583333333333334 | 0 |
| 0.9590277777777777 | 0 |
| 0.9597222222222223 | 0 |
| 0.9604166666666667 | 0 |
| 0.9611111111111111 | 0 |
| 0.9618055555555555 | 0 |
| 0.9625 | 0 |
| 0.9631944444444445 | 0 |
| 0.9638888888888889 | 0 |
| 0.9645833333333332 | 0 |
| 0.9652777777777778 | 0 |
| 0.9659722222222222 | 0 |
| 0.9666666666666667 | 0 |
| 0.967361111111111 | 0 |
| 0.9680555555555556 | 0 |
| 0.96875 | 0 |
| 0.9694444444444444 | 0 |
| 0.970138888888889 | 0 |
| 0.9708333333333333 | 0 |
| 0.9715277777777778 | 0 |
| 0.9722222222222222 | 0 |
| 0.9729166666666668 | 0 |
| 0.9736111111111111 | 0 |
| 0.9743055555555555 | 0 |
| 0.975 | 0 |
| 0.9756944444444445 | 0 |
| 0.9763888888888889 | 0 |
| 0.9770833333333333 | 0 |
| 0.9777777777777777 | 0 |
| 0.9784722222222223 | 0 |
| 0.9791666666666666 | 0 |
| 0.9798611111111111 | 0 |
| 0.9805555555555556 | 0 |
| 0.9812500000000001 | 0 |
| 0.9819444444444444 | 0 |
| 0.9826388888888888 | 0 |
| 0.9833333333333334 | 0 |
| 0.9840277777777778 | 0 |
| 0.9847222222222222 | 0 |
| 0.9854166666666666 | 0 |
| 0.9861111111111112 | 0 |
| 0.9868055555555556 | 0 |
| 0.9874999999999999 | 0 |
| 0.9881944444444444 | 0 |
| 0.9888888888888889 | 0 |
| 0.9895833333333334 | 0 |
| 0.9902777777777777 | 0 |
| 0.9909722222222223 | 0 |
| 0.9916666666666667 | 0 |
| 0.9923611111111111 | 0 |
| 0.9930555555555555 | 0 |
| 0.99375 | 0 |
| 0.9944444444444445 | 0 |
| 0.9951388888888889 | 0 |
| 0.9958333333333332 | 0 |
| 0.9965277777777778 | 0 |
| 0.9972222222222222 | 0 |
| 0.9979166666666667 | 0 |
| 0.998611111111111 | 0 |
| 0.9993055555555556 | 0 |